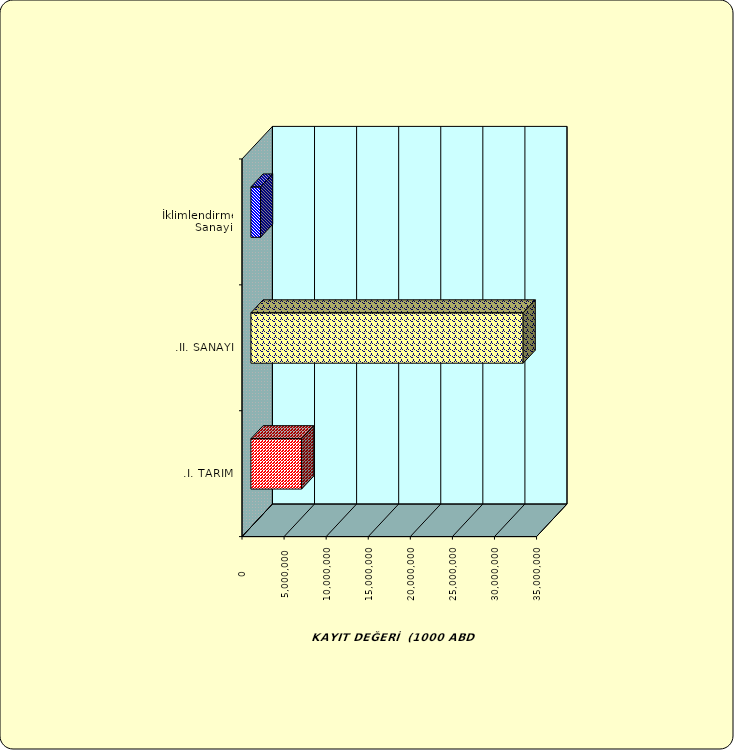
| Category | Series 0 |
|---|---|
| .I. TARIM | 6025759.499 |
| .II. SANAYİ | 32347919.767 |
|  İklimlendirme Sanayii | 1145592.415 |